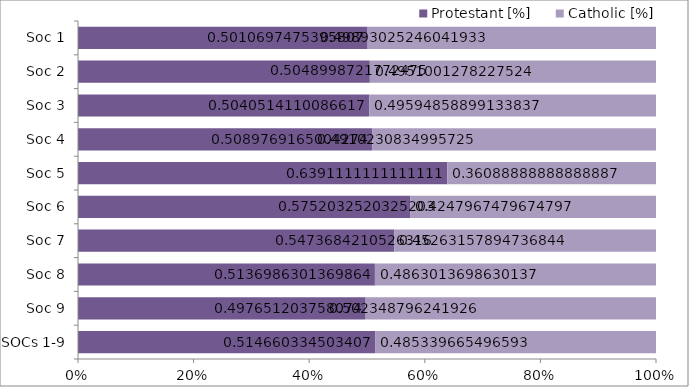
| Category | Protestant | Catholic |
|---|---|---|
| SOCs 1-9 | 0.515 | 0.485 |
| Soc 9 | 0.498 | 0.502 |
| Soc 8 | 0.514 | 0.486 |
| Soc 7 | 0.547 | 0.453 |
| Soc 6 | 0.575 | 0.425 |
| Soc 5 | 0.639 | 0.361 |
| Soc 4 | 0.509 | 0.491 |
| Soc 3 | 0.504 | 0.496 |
| Soc 2 | 0.505 | 0.495 |
| Soc 1 | 0.501 | 0.499 |